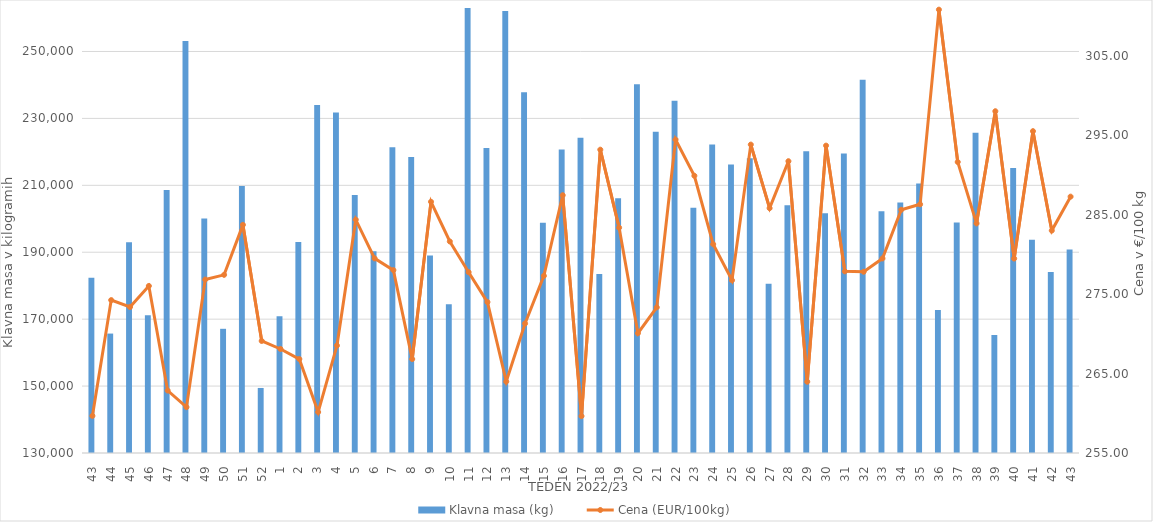
| Category | Klavna masa (kg) |
|---|---|
| 43.0 | 182399 |
| 44.0 | 165696 |
| 45.0 | 193022 |
| 46.0 | 171172 |
| 47.0 | 208597 |
| 48.0 | 253151 |
| 49.0 | 200117 |
| 50.0 | 167119 |
| 51.0 | 209797 |
| 52.0 | 149439 |
| 1.0 | 170843 |
| 2.0 | 193093 |
| 3.0 | 234042 |
| 4.0 | 231737 |
| 5.0 | 207136 |
| 6.0 | 190311 |
| 7.0 | 221366 |
| 8.0 | 218470 |
| 9.0 | 189006 |
| 10.0 | 174425 |
| 11.0 | 265476 |
| 12.0 | 221171 |
| 13.0 | 262102 |
| 14.0 | 237813 |
| 15.0 | 198828 |
| 16.0 | 220686 |
| 17.0 | 224192 |
| 18.0 | 183508 |
| 19.0 | 206133 |
| 20.0 | 240223 |
| 21.0 | 226050 |
| 22.0 | 235273 |
| 23.0 | 203306 |
| 24.0 | 222178 |
| 25.0 | 216259 |
| 26.0 | 218064 |
| 27.0 | 180556 |
| 28.0 | 204078 |
| 29.0 | 220162 |
| 30.0 | 201649 |
| 31.0 | 219538 |
| 32.0 | 241549 |
| 33.0 | 202261 |
| 34.0 | 204903 |
| 35.0 | 210575 |
| 36.0 | 172745 |
| 37.0 | 198877 |
| 38.0 | 225730 |
| 39.0 | 165273 |
| 40.0 | 215175 |
| 41.0 | 193769 |
| 42.0 | 184122 |
| 43.0 | 190834 |